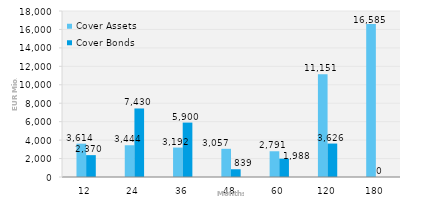
| Category | Cover Assets | Cover Bonds |
|---|---|---|
| 12.0 | 3614.359 | 2369.98 |
| 24.0 | 3444.128 | 7430 |
| 36.0 | 3191.558 | 5900 |
| 48.0 | 3056.722 | 839.444 |
| 60.0 | 2791.077 | 1988 |
| 120.0 | 11150.765 | 3626.41 |
| 180.0 | 16584.524 | 0 |